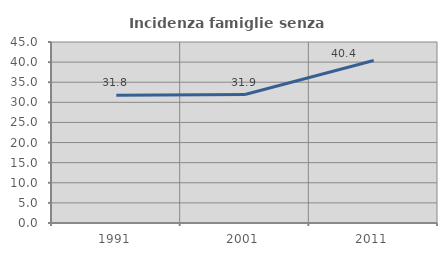
| Category | Incidenza famiglie senza nuclei |
|---|---|
| 1991.0 | 31.767 |
| 2001.0 | 31.942 |
| 2011.0 | 40.406 |